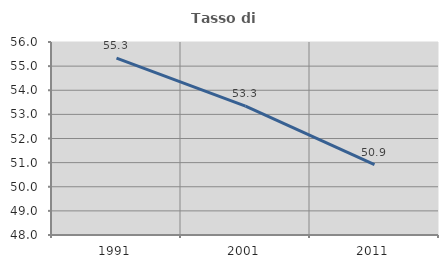
| Category | Tasso di occupazione   |
|---|---|
| 1991.0 | 55.334 |
| 2001.0 | 53.343 |
| 2011.0 | 50.914 |